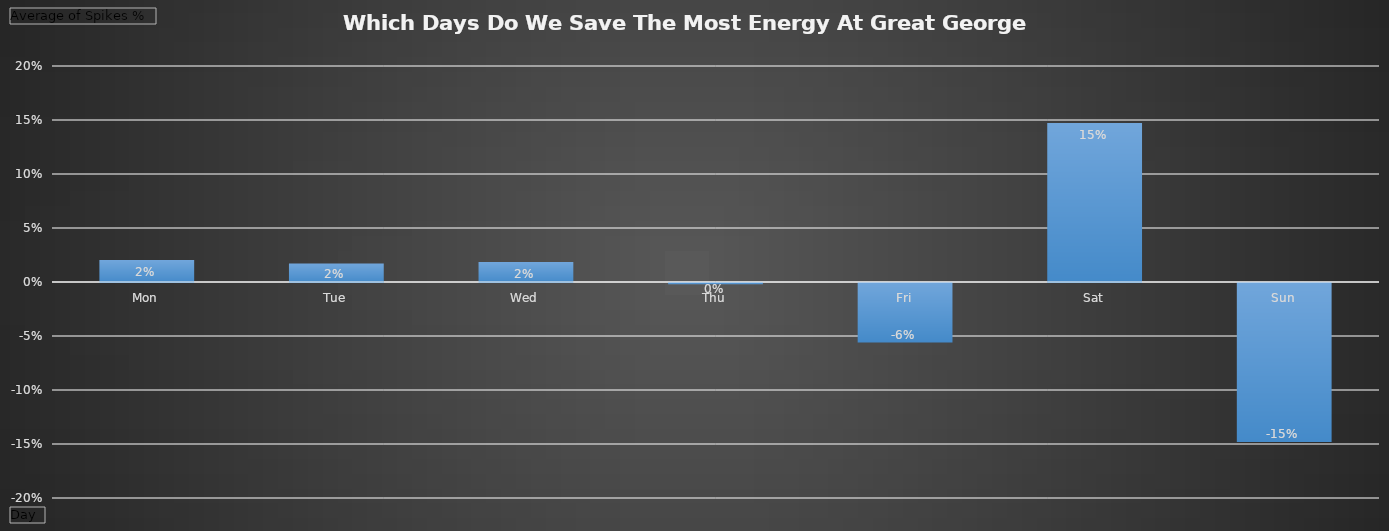
| Category | Total |
|---|---|
| Mon | 0.02 |
| Tue | 0.017 |
| Wed | 0.019 |
| Thu | -0.001 |
| Fri | -0.055 |
| Sat | 0.147 |
| Sun | -0.147 |